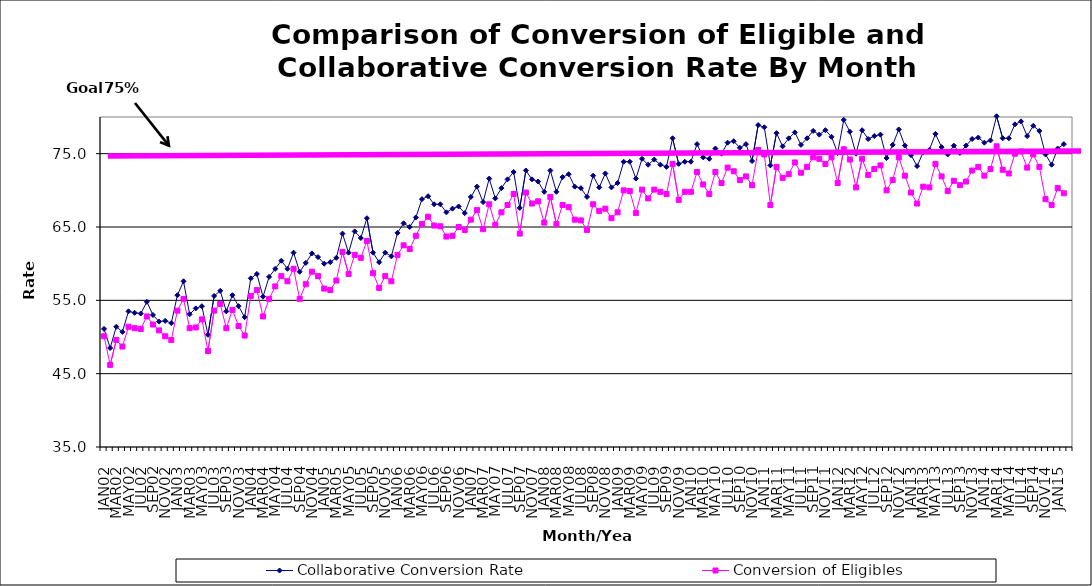
| Category | Collaborative Conversion Rate | Conversion of Eligibles |
|---|---|---|
| JAN02 | 51.1 | 50.1 |
| FEB02 | 48.5 | 46.2 |
| MAR02 | 51.4 | 49.6 |
| APR02 | 50.7 | 48.7 |
| MAY02 | 53.5 | 51.4 |
| JUN02 | 53.3 | 51.2 |
| JUL02 | 53.2 | 51.1 |
| AUG02 | 54.8 | 52.8 |
| SEP02 | 53 | 51.7 |
| OCT02 | 52.1 | 50.9 |
| NOV02 | 52.2 | 50.1 |
| DEC02 | 51.9 | 49.6 |
| JAN03 | 55.7 | 53.6 |
| FEB03 | 57.6 | 55.2 |
| MAR03 | 53.1 | 51.2 |
| APR03 | 53.9 | 51.3 |
| MAY03 | 54.2 | 52.4 |
| JUN03 | 50.3 | 48.1 |
| JUL03 | 55.6 | 53.6 |
| AUG03 | 56.3 | 54.5 |
| SEP03 | 53.5 | 51.2 |
| OCT03 | 55.7 | 53.7 |
| NOV03 | 54.2 | 51.5 |
| DEC03 | 52.7 | 50.2 |
| JAN04 | 58 | 55.6 |
| FEB04 | 58.6 | 56.4 |
| MAR04 | 55.5 | 52.8 |
| APR04 | 58.2 | 55.2 |
| MAY04 | 59.3 | 56.9 |
| JUN04 | 60.4 | 58.3 |
| JUL04 | 59.3 | 57.6 |
| AUG04 | 61.5 | 59.3 |
| SEP04 | 58.9 | 55.2 |
| OCT04 | 60.1 | 57.2 |
| NOV04 | 61.4 | 58.9 |
| DEC04 | 60.9 | 58.3 |
| JAN05 | 60 | 56.6 |
| FEB05 | 60.2 | 56.4 |
| MAR05 | 60.8 | 57.7 |
| APR05 | 64.1 | 61.6 |
| MAY05 | 61.5 | 58.6 |
| JUN05 | 64.4 | 61.2 |
| JUL05 | 63.5 | 60.8 |
| AUG05 | 66.2 | 63.1 |
| SEP05 | 61.5 | 58.7 |
| OCT05 | 60.2 | 56.7 |
| NOV05 | 61.5 | 58.3 |
| DEC05 | 61 | 57.6 |
| JAN06 | 64.2 | 61.2 |
| FEB06 | 65.5 | 62.5 |
| MAR06 | 65 | 62 |
| APR06 | 66.3 | 63.8 |
| MAY06 | 68.8 | 65.4 |
| JUN06 | 69.2 | 66.4 |
| JUL06 | 68.1 | 65.2 |
| AUG06 | 68.1 | 65.1 |
| SEP06 | 67 | 63.7 |
| OCT06 | 67.5 | 63.8 |
| NOV06 | 67.8 | 65 |
| DEC06 | 66.9 | 64.6 |
| JAN07 | 69.1 | 66 |
| FEB07 | 70.5 | 67.3 |
| MAR07 | 68.4 | 64.7 |
| APR07 | 71.6 | 68.1 |
| MAY07 | 68.9 | 65.3 |
| JUN07 | 70.3 | 67 |
| JUL07 | 71.5 | 68 |
| AUG07 | 72.5 | 69.5 |
| SEP07 | 67.6 | 64.1 |
| OCT07 | 72.7 | 69.7 |
| NOV07 | 71.5 | 68.2 |
| DEC07 | 71.2 | 68.5 |
| JAN08 | 69.8 | 65.6 |
| FEB08 | 72.7 | 69.1 |
| MAR08 | 69.8 | 65.4 |
| APR08 | 71.8 | 68 |
| MAY08 | 72.2 | 67.7 |
| JUN08 | 70.5 | 66 |
| JUL08 | 70.3 | 65.9 |
| AUG08 | 69.1 | 64.6 |
| SEP08 | 72 | 68.1 |
| OCT08 | 70.4 | 67.2 |
| NOV08 | 72.3 | 67.5 |
| DEC08 | 70.4 | 66.2 |
| JAN09 | 71 | 67 |
| FEB09 | 73.9 | 70 |
| MAR09 | 73.9 | 69.9 |
| APR09 | 71.6 | 66.9 |
| MAY09 | 74.3 | 70.1 |
| JUN09 | 73.5 | 68.9 |
| JUL09 | 74.2 | 70.1 |
| AUG09 | 73.5 | 69.8 |
| SEP09 | 73.2 | 69.5 |
| OCT09 | 77.1 | 73.6 |
| NOV09 | 73.6 | 68.7 |
| DEC09 | 73.9 | 69.8 |
| JAN10 | 73.9 | 69.8 |
| FEB10 | 76.3 | 72.5 |
| MAR10 | 74.5 | 70.8 |
| APR10 | 74.3 | 69.5 |
| MAY10 | 75.7 | 72.5 |
| JUN10 | 75 | 71 |
| JUL10 | 76.5 | 73.1 |
| AUG10 | 76.7 | 72.6 |
| SEP10 | 75.8 | 71.4 |
| OCT10 | 76.3 | 71.9 |
| NOV10 | 74 | 70.7 |
| DEC10 | 78.9 | 75.5 |
| JAN11 | 78.6 | 74.9 |
| FEB11 | 73.4 | 68 |
| MAR11 | 77.8 | 73.2 |
| APR11 | 76 | 71.7 |
| MAY11 | 77.1 | 72.2 |
| JUN11 | 77.9 | 73.8 |
| JUL11 | 76.2 | 72.4 |
| AUG11 | 77.1 | 73.2 |
| SEP11 | 78.1 | 74.5 |
| OCT11 | 77.6 | 74.3 |
| NOV11 | 78.2 | 73.6 |
| DEC11 | 77.3 | 74.5 |
| JAN12 | 75.1 | 71 |
| FEB12 | 79.6 | 75.6 |
| MAR12 | 78 | 74.2 |
| APR12 | 75 | 70.4 |
| MAY12 | 78.2 | 74.3 |
| JUN12 | 77 | 72.1 |
| JUL12 | 77.4 | 72.9 |
| AUG12 | 77.6 | 73.4 |
| SEP12 | 74.4 | 70 |
| OCT12 | 76.2 | 71.4 |
| NOV12 | 78.3 | 74.5 |
| DEC12 | 76.1 | 72 |
| JAN13 | 74.8 | 69.7 |
| FEB13 | 73.3 | 68.2 |
| MAR13 | 75.2 | 70.5 |
| APR13 | 75.5 | 70.4 |
| MAY13 | 77.7 | 73.6 |
| JUN13 | 75.9 | 71.9 |
| JUL13 | 74.9 | 69.9 |
| AUG13 | 76.1 | 71.3 |
| SEP13 | 75.1 | 70.7 |
| OCT13 | 76.1 | 71.2 |
| NOV13 | 77 | 72.7 |
| DEC13 | 77.2 | 73.2 |
| JAN14 | 76.5 | 72 |
| FEB14 | 76.8 | 72.9 |
| MAR14 | 80.1 | 76 |
| APR14 | 77.1 | 72.8 |
| MAY14 | 77.1 | 72.3 |
| JUN14 | 79 | 75 |
| JUL14 | 79.4 | 75.3 |
| AUG14 | 77.4 | 73.1 |
| SEP14 | 78.8 | 74.9 |
| OCT14 | 78.1 | 73.2 |
| NOV14 | 74.9 | 68.8 |
| DEC14 | 73.5 | 68 |
| JAN15 | 75.7 | 70.3 |
| FEB15 | 76.3 | 69.6 |